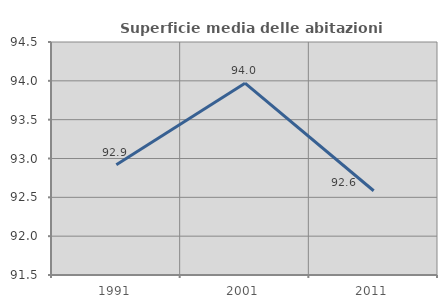
| Category | Superficie media delle abitazioni occupate |
|---|---|
| 1991.0 | 92.919 |
| 2001.0 | 93.97 |
| 2011.0 | 92.585 |